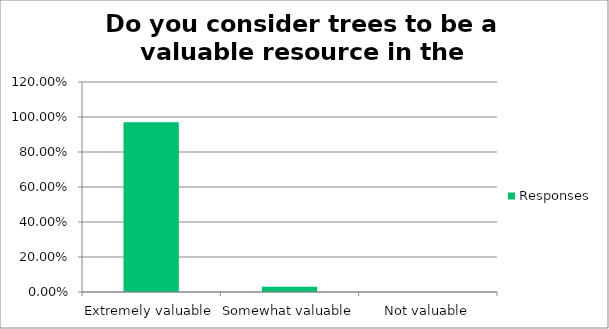
| Category | Responses |
|---|---|
| Extremely valuable | 0.97 |
| Somewhat valuable | 0.03 |
| Not valuable | 0 |